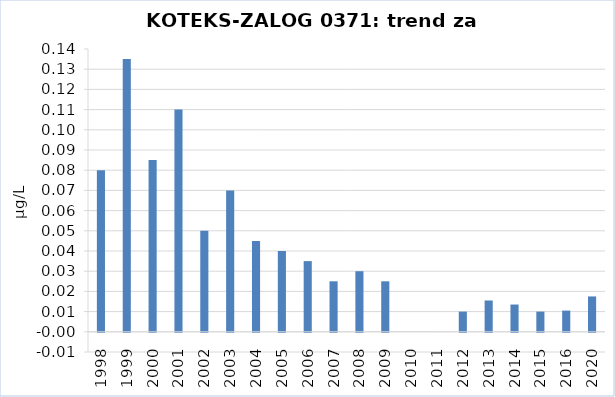
| Category | Vsota |
|---|---|
| 1998 | 0.08 |
| 1999 | 0.135 |
| 2000 | 0.085 |
| 2001 | 0.11 |
| 2002 | 0.05 |
| 2003 | 0.07 |
| 2004 | 0.045 |
| 2005 | 0.04 |
| 2006 | 0.035 |
| 2007 | 0.025 |
| 2008 | 0.03 |
| 2009 | 0.025 |
| 2010 | 0 |
| 2011 | 0 |
| 2012 | 0.01 |
| 2013 | 0.016 |
| 2014 | 0.014 |
| 2015 | 0.01 |
| 2016 | 0.01 |
| 2020 | 0.018 |